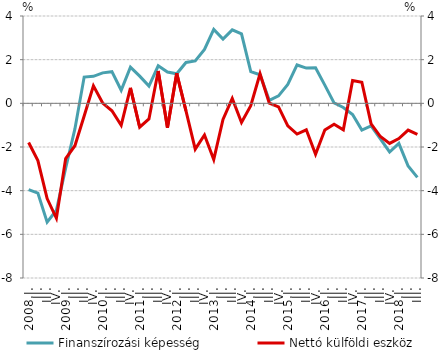
| Category | Finanszírozási képesség |
|---|---|
| 2008.I. | -3.953 |
| II. | -4.111 |
| III. | -5.439 |
| IV. | -4.897 |
| 2009.I. | -2.976 |
| II. | -1.172 |
| III. | 1.202 |
| IV. | 1.236 |
| 2010.I. | 1.395 |
| II. | 1.45 |
| III. | 0.599 |
| IV. | 1.66 |
| 2011.I. | 1.246 |
| II. | 0.788 |
| III. | 1.72 |
| IV. | 1.434 |
| 2012.I. | 1.352 |
| II. | 1.873 |
| III. | 1.941 |
| IV. | 2.467 |
| 2013.I. | 3.383 |
| II. | 2.94 |
| III. | 3.364 |
| IV. | 3.185 |
| 2014.I. | 1.451 |
| II. | 1.308 |
| III. | 0.138 |
| IV. | 0.343 |
| 2015.I. | 0.863 |
| II. | 1.758 |
| III. | 1.614 |
| IV. | 1.626 |
| 2016.I. | 0.833 |
| II. | 0.017 |
| III. | -0.191 |
| IV. | -0.513 |
| 2017.I. | -1.223 |
| II. | -1.037 |
| III. | -1.629 |
| IV. | -2.228 |
| 2018.I. | -1.834 |
| II. | -2.871 |
| III. | -3.393 |